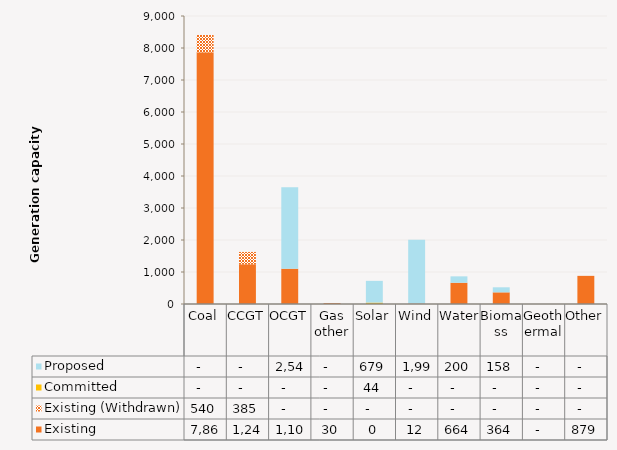
| Category | Existing | Existing (Withdrawn) | Committed | Proposed |
|---|---|---|---|---|
| Coal | 7866 | 540 | 0 | 0 |
| CCGT | 1241.5 | 385 | 0 | 0 |
| OCGT | 1103 | 0 | 0 | 2545 |
| Gas other | 30 | 0 | 0 | 0 |
| Solar | 0.4 | 0 | 44 | 679 |
| Wind | 12 | 0 | 0 | 1999 |
| Water | 663.9 | 0 | 0 | 200 |
| Biomass | 364 | 0 | 0 | 158 |
| Geothermal | 0 | 0 | 0 | 0 |
| Other | 879.3 | 0 | 0 | 0 |